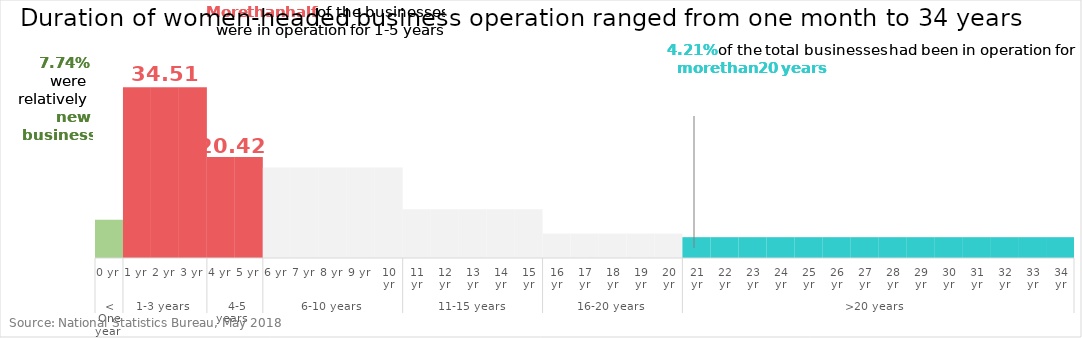
| Category | Nature of women-owned business |
|---|---|
| 0 | 7.74 |
| 1 | 34.51 |
| 2 | 34.51 |
| 3 | 34.51 |
| 4 | 20.42 |
| 5 | 20.42 |
| 6 | 18.3 |
| 7 | 18.3 |
| 8 | 18.3 |
| 9 | 18.3 |
| 10 | 18.3 |
| 11 | 9.86 |
| 12 | 9.86 |
| 13 | 9.86 |
| 14 | 9.86 |
| 15 | 9.86 |
| 16 | 4.93 |
| 17 | 4.93 |
| 18 | 4.93 |
| 19 | 4.93 |
| 20 | 4.93 |
| 21 | 4.21 |
| 22 | 4.21 |
| 23 | 4.21 |
| 24 | 4.21 |
| 25 | 4.21 |
| 26 | 4.21 |
| 27 | 4.21 |
| 28 | 4.21 |
| 29 | 4.21 |
| 30 | 4.21 |
| 31 | 4.21 |
| 32 | 4.21 |
| 33 | 4.21 |
| 34 | 4.21 |